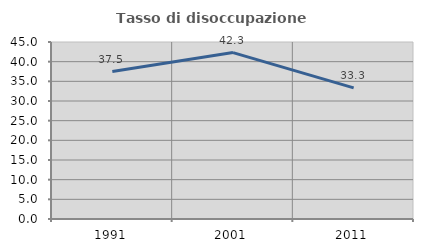
| Category | Tasso di disoccupazione giovanile  |
|---|---|
| 1991.0 | 37.5 |
| 2001.0 | 42.308 |
| 2011.0 | 33.333 |